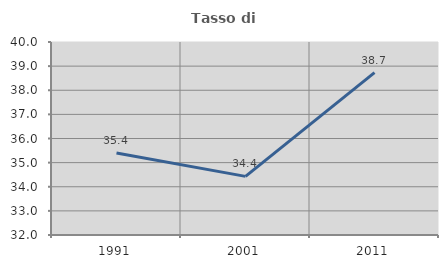
| Category | Tasso di occupazione   |
|---|---|
| 1991.0 | 35.403 |
| 2001.0 | 34.43 |
| 2011.0 | 38.729 |